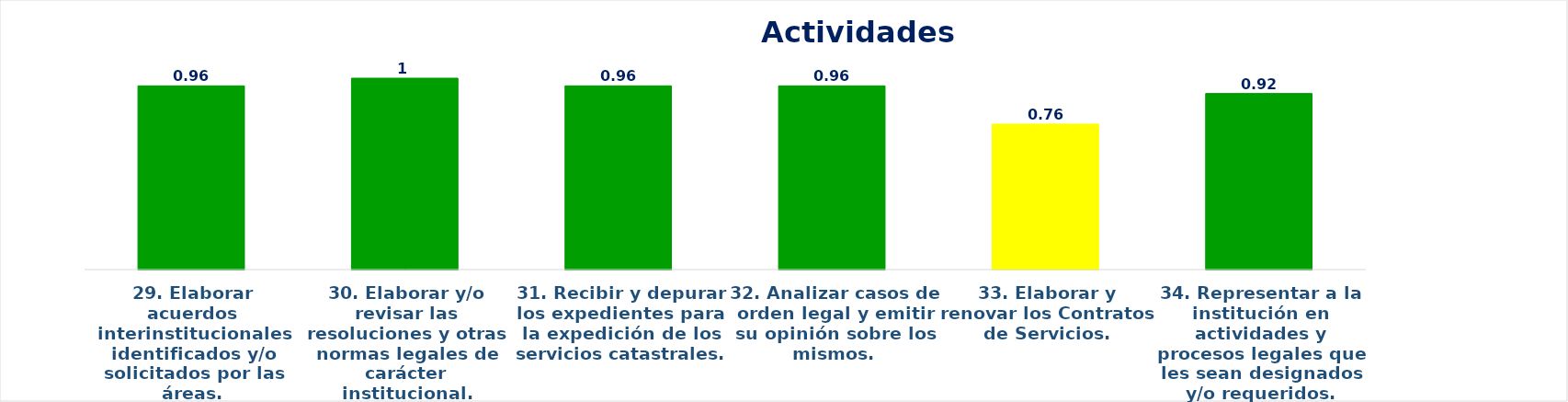
| Category | Series 0 |
|---|---|
| 29. Elaborar acuerdos interinstitucionales identificados y/o solicitados por las áreas. | 0.96 |
| 30. Elaborar y/o revisar las resoluciones y otras normas legales de carácter institucional. | 1 |
| 31. Recibir y depurar los expedientes para la expedición de los servicios catastrales.  | 0.96 |
| 32. Analizar casos de orden legal y emitir su opinión sobre los mismos. | 0.96 |
| 33. Elaborar y renovar los Contratos de Servicios. | 0.76 |
| 34. Representar a la institución en actividades y procesos legales que les sean designados y/o requeridos. | 0.92 |